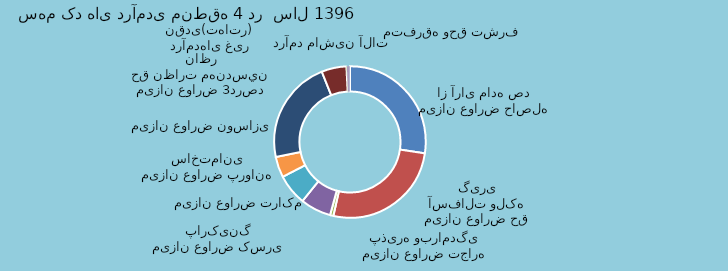
| Category | Series 0 | Series 1 |
|---|---|---|
| میزان عوارض حاصله از آرای ماده صد | 82576167 |  |
| میزان عوارض حق آسفالت ولکه گیری | 78765029 |  |
| میزان عوارض تجاره پذیره وبرامدگی | 2139622 |  |
| میزان عوارض کسری پارکینگ | 19742571 |  |
| میزان عوارض تراکم | 19924705 |  |
| میزان عوارض پروانه ساختمانی | 13365528 |  |
| میزان عوارض نوسازی | 66578318 |  |
| درآمدهای غیر نقدی(تهاتر) | 16037961 |  |
| میزان عوارض 3درصد حق نظارت مهندسين ناظر | 289876 |  |
| درآمد ماشین آلات  | 1745888 |  |
| متفرقه وحق تشرف | 224432 |  |